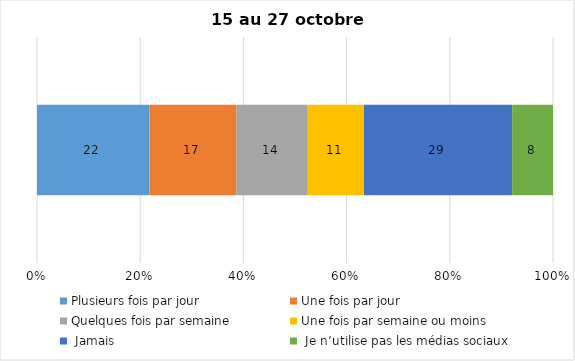
| Category | Plusieurs fois par jour | Une fois par jour | Quelques fois par semaine   | Une fois par semaine ou moins   |  Jamais   |  Je n’utilise pas les médias sociaux |
|---|---|---|---|---|---|---|
| 0 | 22 | 17 | 14 | 11 | 29 | 8 |